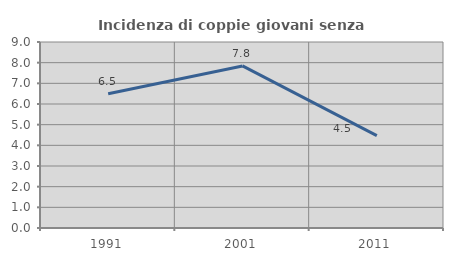
| Category | Incidenza di coppie giovani senza figli |
|---|---|
| 1991.0 | 6.5 |
| 2001.0 | 7.843 |
| 2011.0 | 4.467 |